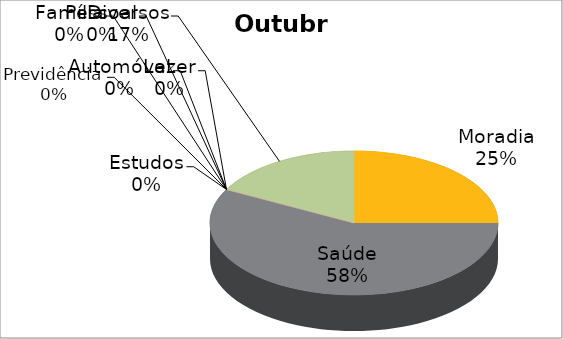
| Category | Outubro | Janeiro |
|---|---|---|
| Moradia | 1300 | 4020 |
| Saúde | 3000 | 100 |
| Estudos | 0 | 680 |
| Automóvel | 0 | 1230 |
| Pessoal | 0 | 640 |
| Lazer | 0 | 400 |
| Família | 0 | 700 |
| Previdência | 0 | 0 |
| Diversos | 900 | 0 |